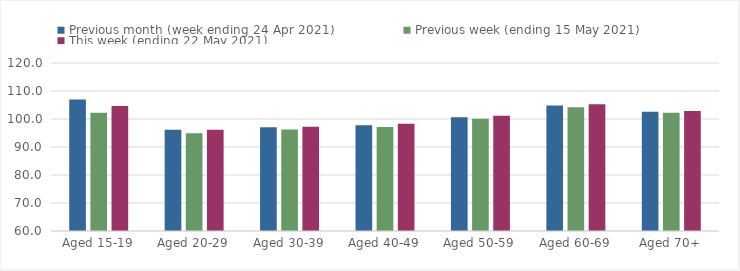
| Category | Previous month (week ending 24 Apr 2021) | Previous week (ending 15 May 2021) | This week (ending 22 May 2021) |
|---|---|---|---|
| Aged 15-19 | 106.97 | 102.24 | 104.65 |
| Aged 20-29 | 96.2 | 94.89 | 96.12 |
| Aged 30-39 | 97.04 | 96.23 | 97.22 |
| Aged 40-49 | 97.74 | 97.15 | 98.31 |
| Aged 50-59 | 100.59 | 100.09 | 101.15 |
| Aged 60-69 | 104.82 | 104.2 | 105.23 |
| Aged 70+ | 102.58 | 102.24 | 102.9 |